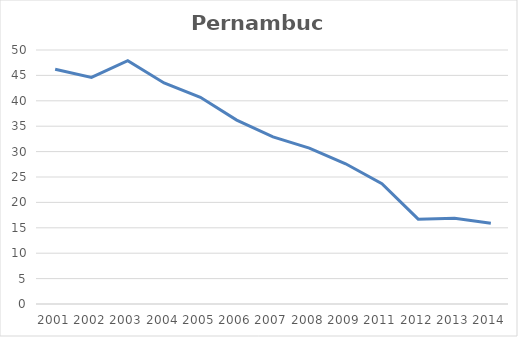
| Category | Total |
|---|---|
| 2001.0 | 46.2 |
| 2002.0 | 44.6 |
| 2003.0 | 47.9 |
| 2004.0 | 43.5 |
| 2005.0 | 40.7 |
| 2006.0 | 36.2 |
| 2007.0 | 32.9 |
| 2008.0 | 30.7 |
| 2009.0 | 27.6 |
| 2011.0 | 23.7 |
| 2012.0 | 16.7 |
| 2013.0 | 16.9 |
| 2014.0 | 15.9 |